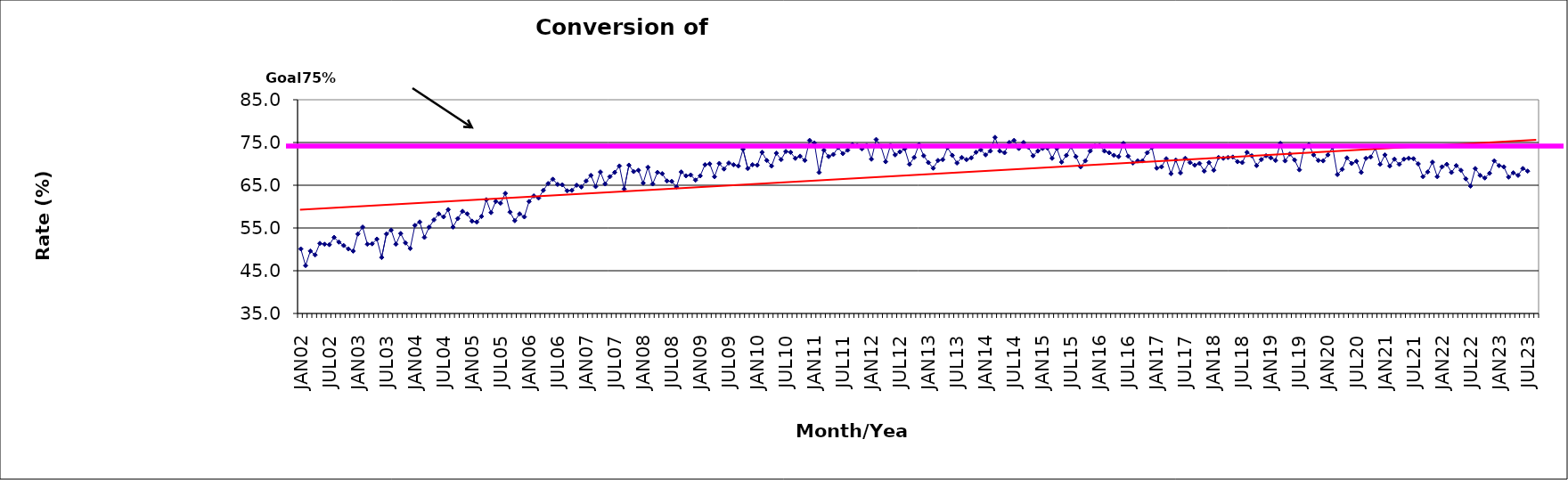
| Category | Series 0 |
|---|---|
| JAN02 | 50.1 |
| FEB02 | 46.2 |
| MAR02 | 49.6 |
| APR02 | 48.7 |
| MAY02 | 51.4 |
| JUN02 | 51.2 |
| JUL02 | 51.1 |
| AUG02 | 52.8 |
| SEP02 | 51.7 |
| OCT02 | 50.9 |
| NOV02 | 50.1 |
| DEC02 | 49.6 |
| JAN03 | 53.6 |
| FEB03 | 55.2 |
| MAR03 | 51.2 |
| APR03 | 51.3 |
| MAY03 | 52.4 |
| JUN03 | 48.1 |
| JUL03 | 53.6 |
| AUG03 | 54.5 |
| SEP03 | 51.2 |
| OCT03 | 53.7 |
| NOV03 | 51.5 |
| DEC03 | 50.2 |
| JAN04 | 55.6 |
| FEB04 | 56.4 |
| MAR04 | 52.8 |
| APR04 | 55.2 |
| MAY04 | 56.9 |
| JUN04 | 58.3 |
| JUL04 | 57.6 |
| AUG04 | 59.3 |
| SEP04 | 55.2 |
| OCT04 | 57.2 |
| NOV04 | 58.9 |
| DEC04 | 58.3 |
| JAN05 | 56.6 |
| FEB05 | 56.4 |
| MAR05 | 57.7 |
| APR05 | 61.6 |
| MAY05 | 58.6 |
| JUN05 | 61.2 |
| JUL05 | 60.8 |
| AUG05 | 63.1 |
| SEP05 | 58.7 |
| OCT05 | 56.7 |
| NOV05 | 58.3 |
| DEC05 | 57.6 |
| JAN06 | 61.2 |
| FEB06 | 62.5 |
| MAR06 | 62 |
| APR06 | 63.8 |
| MAY06 | 65.4 |
| JUN06 | 66.4 |
| JUL06 | 65.2 |
| AUG06 | 65.1 |
| SEP06 | 63.7 |
| OCT06 | 63.8 |
| NOV06 | 65 |
| DEC06 | 64.6 |
| JAN07 | 66 |
| FEB07 | 67.3 |
| MAR07 | 64.7 |
| APR07 | 68.1 |
| MAY07 | 65.3 |
| JUN07 | 67 |
| JUL07 | 68 |
| AUG07 | 69.5 |
| SEP07 | 64.1 |
| OCT07 | 69.7 |
| NOV07 | 68.2 |
| DEC07 | 68.5 |
| JAN08 | 65.5 |
| FEB08 | 69.2 |
| MAR08 | 65.3 |
| APR08 | 68 |
| MAY08 | 67.7 |
| JUN08 | 66 |
| JUL08 | 65.9 |
| AUG08 | 64.6 |
| SEP08 | 68.1 |
| OCT08 | 67.2 |
| NOV08 | 67.4 |
| DEC08 | 66.2 |
| JAN09 | 67.2 |
| FEB09 | 69.8 |
| MAR09 | 70 |
| APR09 | 67 |
| MAY09 | 70.1 |
| JUN09 | 68.8 |
| JUL09 | 70.2 |
| AUG09 | 69.8 |
| SEP09 | 69.5 |
| OCT09 | 73.4 |
| NOV09 | 68.9 |
| DEC09 | 69.8 |
| JAN10 | 69.7 |
| FEB10 | 72.7 |
| MAR10 | 70.8 |
| APR10 | 69.5 |
| MAY10 | 72.5 |
| JUN10 | 71 |
| JUL10 | 72.9 |
| AUG10 | 72.7 |
| SEP10 | 71.3 |
| OCT10 | 71.8 |
| NOV10 | 70.8 |
| DEC10 | 75.5 |
| JAN11 | 74.9 |
| FEB11 | 68 |
| MAR11 | 73.2 |
| APR11 | 71.7 |
| MAY11 | 72.2 |
| JUN11 | 73.8 |
| JUL11 | 72.4 |
| AUG11 | 73.2 |
| SEP11 | 74.5 |
| OCT11 | 74.3 |
| NOV11 | 73.5 |
| DEC11 | 74.3 |
| JAN12 | 71.1 |
| FEB12 | 75.7 |
| MAR12 | 74.1 |
| APR12 | 70.5 |
| MAY12 | 74.3 |
| JUN12 | 72.1 |
| JUL12 | 72.8 |
| AUG12 | 73.5 |
| SEP12 | 69.9 |
| OCT12 | 71.5 |
| NOV12 | 74.5 |
| DEC12 | 71.9 |
| JAN13 | 70.3 |
| FEB13 | 69 |
| MAR13 | 70.8 |
| APR13 | 71 |
| MAY13 | 73.8 |
| JUN13 | 72 |
| JUL13 | 70.2 |
| AUG13 | 71.5 |
| SEP13 | 71 |
| OCT13 | 71.4 |
| NOV13 | 72.7 |
| DEC13 | 73.3 |
| JAN14 | 72.1 |
| FEB14 | 73 |
| MAR14 | 76.2 |
| APR14 | 73 |
| MAY14 | 72.6 |
| JUN14 | 75 |
| JUL14 | 75.5 |
| AUG14 | 73.6 |
| SEP14 | 75 |
| OCT14 | 73.9 |
| NOV14 | 71.9 |
| DEC14 | 73 |
| JAN15 | 73.6 |
| FEB15 | 73.7 |
| MAR15 | 71.3 |
| APR15 | 73.6 |
| MAY15 | 70.4 |
| JUN15 | 72 |
| JUL15 | 74 |
| AUG15 | 71.7 |
| SEP15 | 69.3 |
| OCT15 | 70.7 |
| NOV15 | 73 |
| DEC15 | 74.2 |
| JAN16 | 74.3 |
| FEB16 | 73 |
| MAR16 | 72.6 |
| APR16 | 72 |
| MAY16 | 71.7 |
| JUN16 | 74.8 |
| JUL16 | 71.8 |
| AUG16 | 70.2 |
| SEP16 | 70.7 |
| OCT16 | 70.7 |
| NOV16 | 72.6 |
| DEC16 | 73.8 |
| JAN17 | 69 |
| FEB17 | 69.3 |
| MAR17 | 71.2 |
| APR17 | 67.7 |
| MAY17 | 70.9 |
| JUN17 | 67.9 |
| JUL17 | 71.3 |
| AUG17 | 70.3 |
| SEP17 | 69.7 |
| OCT17 | 70.1 |
| NOV17 | 68.3 |
| DEC17 | 70.3 |
| JAN18 | 68.5 |
| FEB18 | 71.5 |
| MAR18 | 71.3 |
| APR18 | 71.5 |
| MAY18 | 71.6 |
| JUN18 | 70.5 |
| JUL18 | 70.3 |
| AUG18 | 72.7 |
| SEP18 | 71.9 |
| OCT18 | 69.6 |
| NOV18 | 71 |
| DEC18 | 71.9 |
| JAN19 | 71.4 |
| FEB19 | 70.8 |
| MAR19 | 74.8 |
| APR19 | 70.7 |
| MAY19 | 72.3 |
| JUN19 | 70.9 |
| JUL19 | 68.6 |
| AUG19 | 73.8 |
| SEP19 | 74.5 |
| OCT19 | 72.1 |
| NOV19 | 70.8 |
| DEC19 | 70.7 |
| JAN20 | 72.1 |
| FEB20 | 73.9 |
| MAR20 | 67.5 |
| APR20 | 68.7 |
| MAY20 | 71.4 |
| JUN20 | 70.1 |
| JUL20 | 70.6 |
| AUG20 | 68 |
| SEP20 | 71.3 |
| OCT20 | 71.6 |
| NOV20 | 73.7 |
| DEC20 | 69.9 |
| JAN21 | 72.1 |
| FEB21 | 69.5 |
| MAR21 | 71.1 |
| APR21 | 69.9 |
| MAY21 | 71.1 |
| JUN21 | 71.3 |
| JUL21 | 71.2 |
| AUG21 | 70 |
| SEP21 | 67 |
| OCT21 | 68.1 |
| NOV21 | 70.4 |
| DEC21 | 67 |
| JAN22 | 69.3 |
| FEB22 | 69.9 |
| MAR22 | 68 |
| APR22 | 69.6 |
| MAY22 | 68.5 |
| JUN22 | 66.5 |
| JUL22 | 64.8 |
| AUG22 | 68.9 |
| SEP22 | 67.3 |
| OCT22 | 66.7 |
| NOV22 | 67.8 |
| DEC22 | 70.7 |
| JAN23 | 69.6 |
| FEB23 | 69.3 |
| MAR23 | 66.9 |
| APR23 | 67.9 |
| MAY23 | 67.3 |
| JUN23 | 68.9 |
| JUL23 | 68.3 |